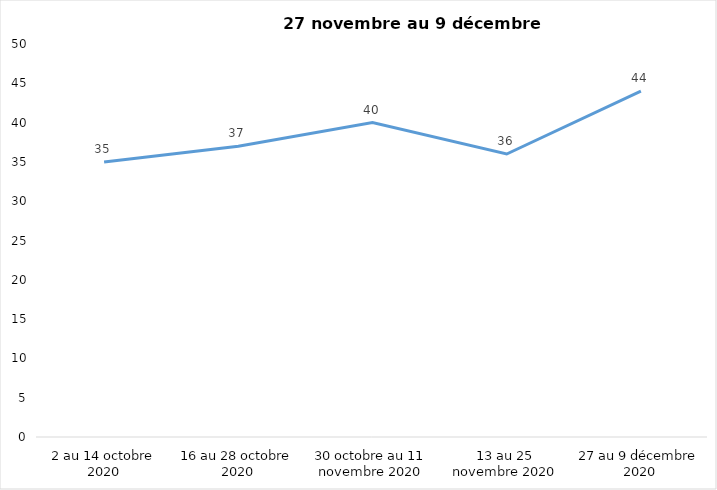
| Category | Series 0 |
|---|---|
| 2 au 14 octobre 2020 | 35 |
| 16 au 28 octobre 2020 | 37 |
| 30 octobre au 11 novembre 2020 | 40 |
| 13 au 25 novembre 2020 | 36 |
| 27 au 9 décembre 2020 | 44 |